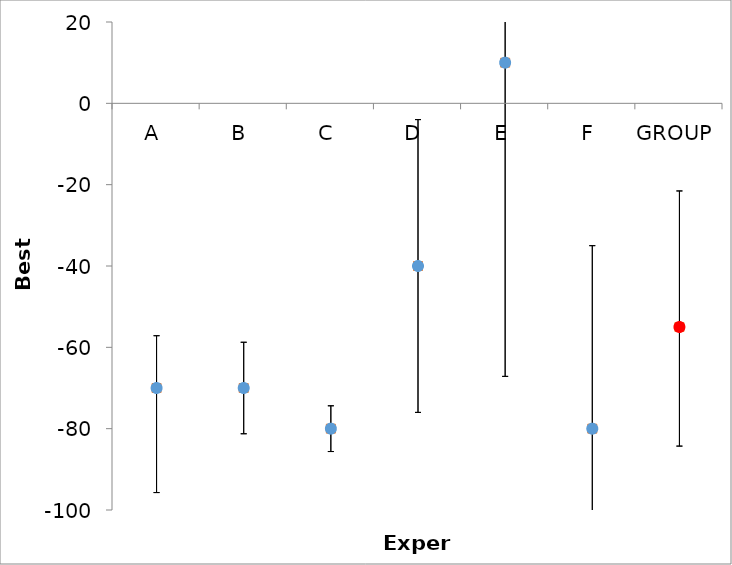
| Category | Series 1 | Series 0 |
|---|---|---|
| A | -70 | -70 |
| B | -70 | -70 |
| C | -80 | -80 |
| D | -40 | -40 |
| E | 10 | 10 |
| F | -80 | -80 |
| GROUP | -55 | -55 |